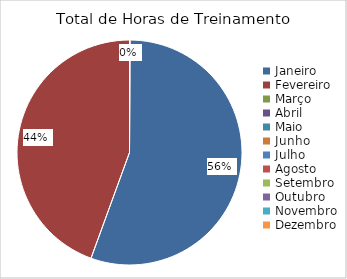
| Category | Horas de Treinamento |
|---|---|
| Janeiro | 10 |
| Fevereiro | 8 |
| Março | 0 |
| Abril | 0 |
| Maio | 0 |
| Junho | 0 |
| Julho | 0 |
| Agosto | 0 |
| Setembro | 0 |
| Outubro | 0 |
| Novembro | 0 |
| Dezembro | 0 |